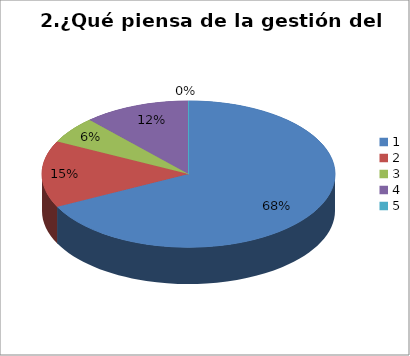
| Category | Series 0 |
|---|---|
| 0 | 23 |
| 1 | 5 |
| 2 | 2 |
| 3 | 4 |
| 4 | 0 |